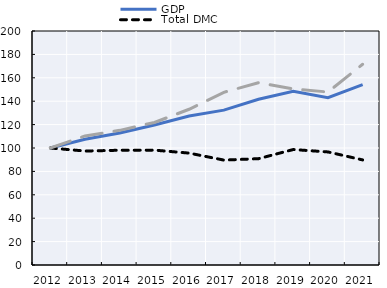
| Category | GDP  | Total DMC | Resource productivity |
|---|---|---|---|
| 2012 | 100 | 100 | 100 |
| 2013 | 107.446 | 97.405 | 110.305 |
| 2014 | 112.884 | 98.084 | 115.089 |
| 2015 | 119.612 | 98.175 | 121.832 |
| 2016 | 127.314 | 95.637 | 133.104 |
| 2017 | 132.348 | 89.663 | 147.608 |
| 2018 | 141.652 | 90.879 | 155.852 |
| 2019 | 148.481 | 98.687 | 150.458 |
| 2020 | 143.072 | 96.639 | 147.863 |
| 2021 | 154.1 | 89.813 | 171.578 |